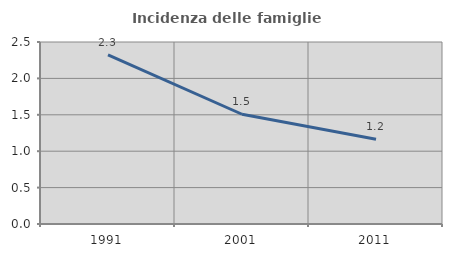
| Category | Incidenza delle famiglie numerose |
|---|---|
| 1991.0 | 2.323 |
| 2001.0 | 1.508 |
| 2011.0 | 1.165 |